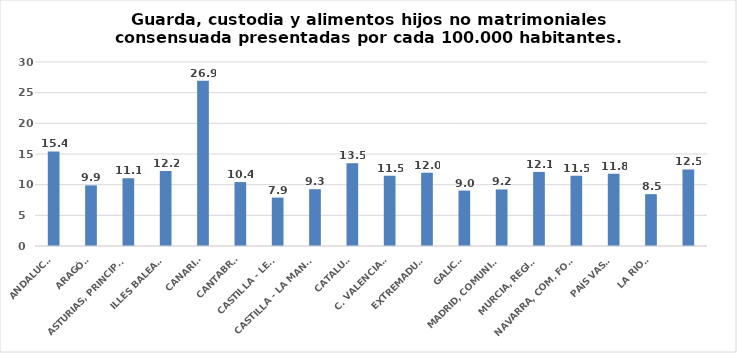
| Category | Series 0 |
|---|---|
| ANDALUCÍA | 15.412 |
| ARAGÓN | 9.884 |
| ASTURIAS, PRINCIPADO | 11.05 |
| ILLES BALEARS | 12.242 |
| CANARIAS | 26.925 |
| CANTABRIA | 10.423 |
| CASTILLA - LEÓN | 7.89 |
| CASTILLA - LA MANCHA | 9.258 |
| CATALUÑA | 13.503 |
| C. VALENCIANA | 11.472 |
| EXTREMADURA | 11.952 |
| GALICIA | 9.036 |
| MADRID, COMUNIDAD | 9.222 |
| MURCIA, REGIÓN | 12.08 |
| NAVARRA, COM. FORAL | 11.452 |
| PAÍS VASCO | 11.78 |
| LA RIOJA | 8.451 |